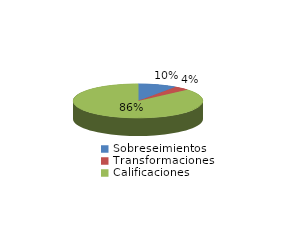
| Category | Series 0 |
|---|---|
| Sobreseimientos | 121 |
| Transformaciones | 49 |
| Calificaciones | 1078 |